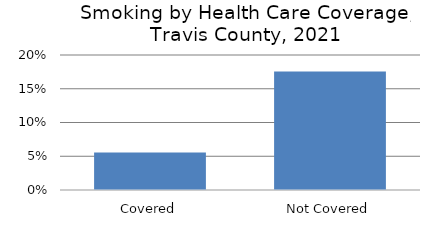
| Category | Series 0 |
|---|---|
| Covered | 0.056 |
| Not Covered | 0.176 |